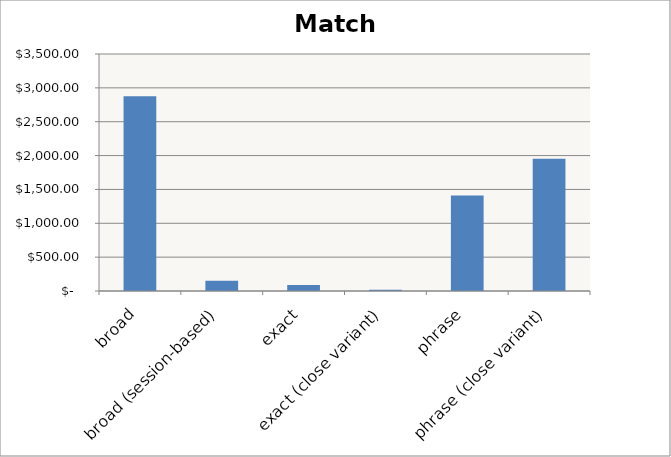
| Category | Match Type |
|---|---|
| broad | 2877.16 |
| broad (session-based) | 150.84 |
| exact | 87.31 |
| exact (close variant) | 20.21 |
| phrase | 1410.52 |
| phrase (close variant) | 1953.89 |